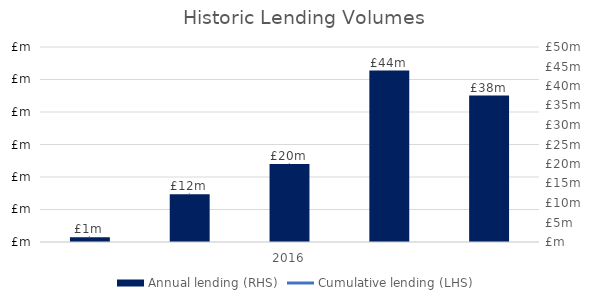
| Category | Annual lending (RHS) |
|---|---|
| 0 | 1197727 |
| 1 | 12249400 |
| 2 | 20019706 |
| 3 | 43972530 |
| 4 | 37548000 |